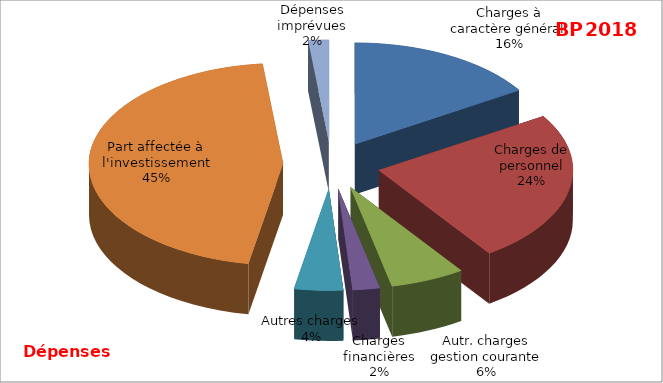
| Category | Series 0 |
|---|---|
| Charges à caractère général | 345033.82 |
| Charges de personnel | 522628 |
| Autr. charges gestion courante | 133493 |
| Charges financières | 48070 |
| Autres charges | 86987.18 |
| Part affectée à l'investissement | 976990 |
| Dépenses imprévues | 36560 |